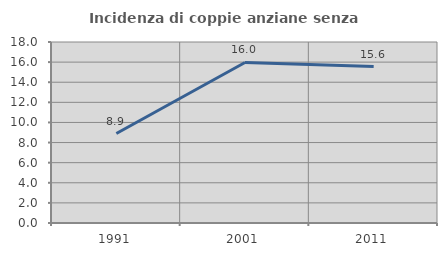
| Category | Incidenza di coppie anziane senza figli  |
|---|---|
| 1991.0 | 8.901 |
| 2001.0 | 15.962 |
| 2011.0 | 15.556 |